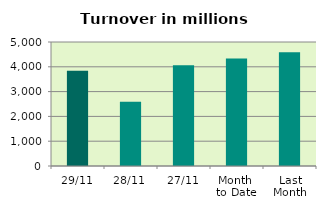
| Category | Series 0 |
|---|---|
| 29/11 | 3839.534 |
| 28/11 | 2587.541 |
| 27/11 | 4064.066 |
| Month 
to Date | 4332.538 |
| Last
Month | 4589.98 |